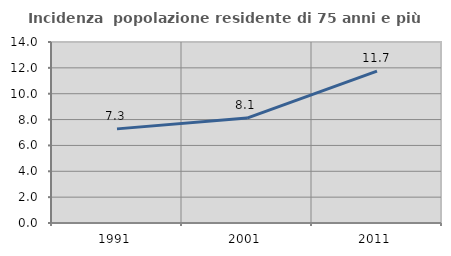
| Category | Incidenza  popolazione residente di 75 anni e più |
|---|---|
| 1991.0 | 7.281 |
| 2001.0 | 8.113 |
| 2011.0 | 11.744 |